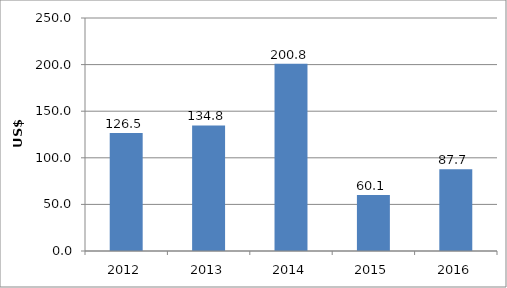
| Category | US$ millions |
|---|---|
| 2012.0 | 126.478 |
| 2013.0 | 134.786 |
| 2014.0 | 200.779 |
| 2015.0 | 60.125 |
| 2016.0 | 87.732 |